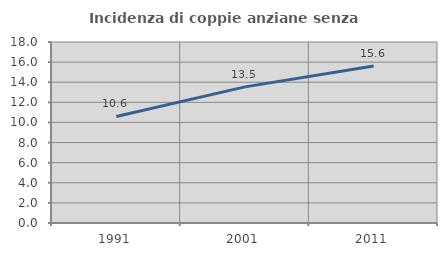
| Category | Incidenza di coppie anziane senza figli  |
|---|---|
| 1991.0 | 10.598 |
| 2001.0 | 13.539 |
| 2011.0 | 15.618 |